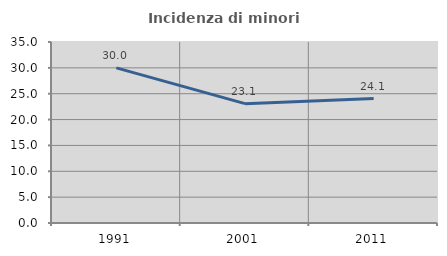
| Category | Incidenza di minori stranieri |
|---|---|
| 1991.0 | 30 |
| 2001.0 | 23.077 |
| 2011.0 | 24.074 |